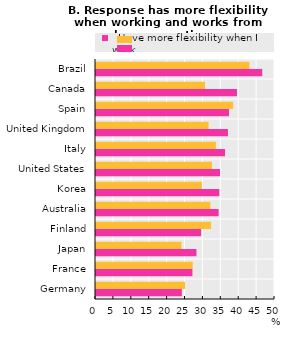
| Category |   Have more flexibility when I work |   Work from home sometimes |
|---|---|---|
| Germany | 23.982 | 24.858 |
| France | 26.935 | 27.013 |
| Japan | 28.059 | 23.881 |
| Finland | 29.361 | 32.133 |
| Australia | 34.258 | 31.949 |
| Korea | 34.447 | 29.577 |
| United States | 34.639 | 32.382 |
| Italy | 36.049 | 33.482 |
| United Kingdom | 36.858 | 31.446 |
| Spain | 37.151 | 38.306 |
| Canada | 39.376 | 30.449 |
| Brazil | 46.432 | 42.847 |